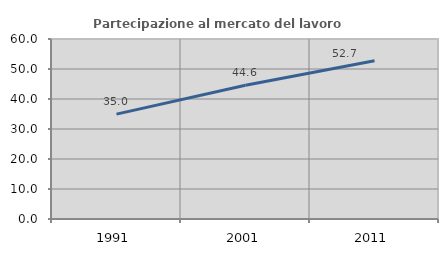
| Category | Partecipazione al mercato del lavoro  femminile |
|---|---|
| 1991.0 | 34.968 |
| 2001.0 | 44.583 |
| 2011.0 | 52.741 |